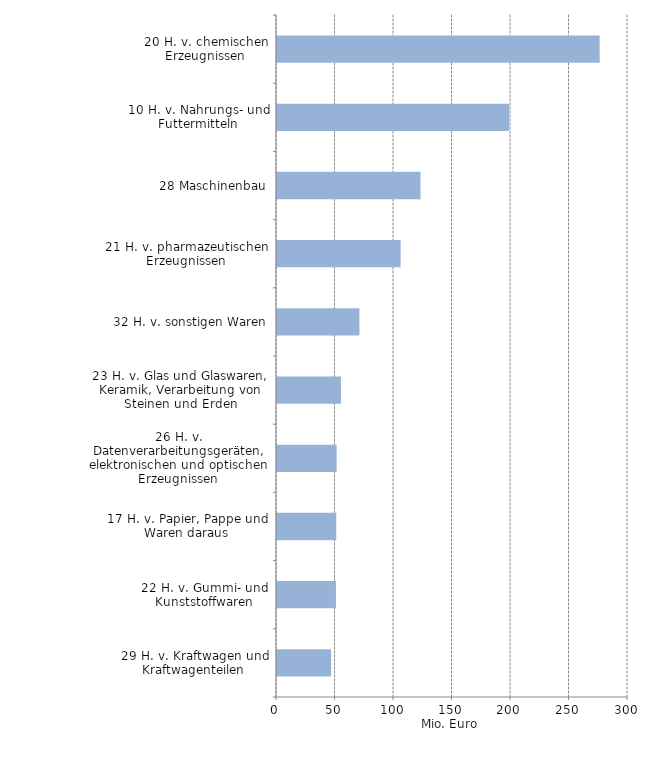
| Category | Mio. Euro |
|---|---|
| 20 H. v. chemischen Erzeugnissen | 275.785 |
| 10 H. v. Nahrungs- und Futtermitteln | 198.347 |
| 28 Maschinenbau | 122.652 |
| 21 H. v. pharmazeutischen Erzeugnissen | 105.637 |
| 32 H. v. sonstigen Waren | 70.443 |
| 23 H. v. Glas und Glaswaren, Keramik, Verarbeitung von Steinen und Erden | 54.652 |
| 26 H. v. Datenverarbeitungsgeräten, elektronischen und optischen Erzeugnissen | 50.981 |
| 17 H. v. Papier, Pappe und Waren daraus | 50.641 |
| 22 H. v. Gummi- und Kunststoffwaren | 50.399 |
| 29 H. v. Kraftwagen und Kraftwagenteilen | 46.189 |